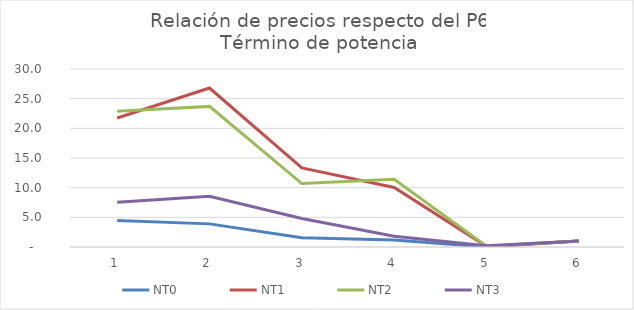
| Category | NT0 | NT1 | NT2 | NT3 |
|---|---|---|---|---|
| 0 | 4.446 | 21.738 | 22.891 | 7.539 |
| 1 | 3.897 | 26.791 | 23.699 | 8.567 |
| 2 | 1.545 | 13.34 | 10.695 | 4.797 |
| 3 | 1.166 | 10.041 | 11.421 | 1.801 |
| 4 | 0.01 | 0.104 | 0.137 | 0.197 |
| 5 | 1 | 1 | 1 | 1 |